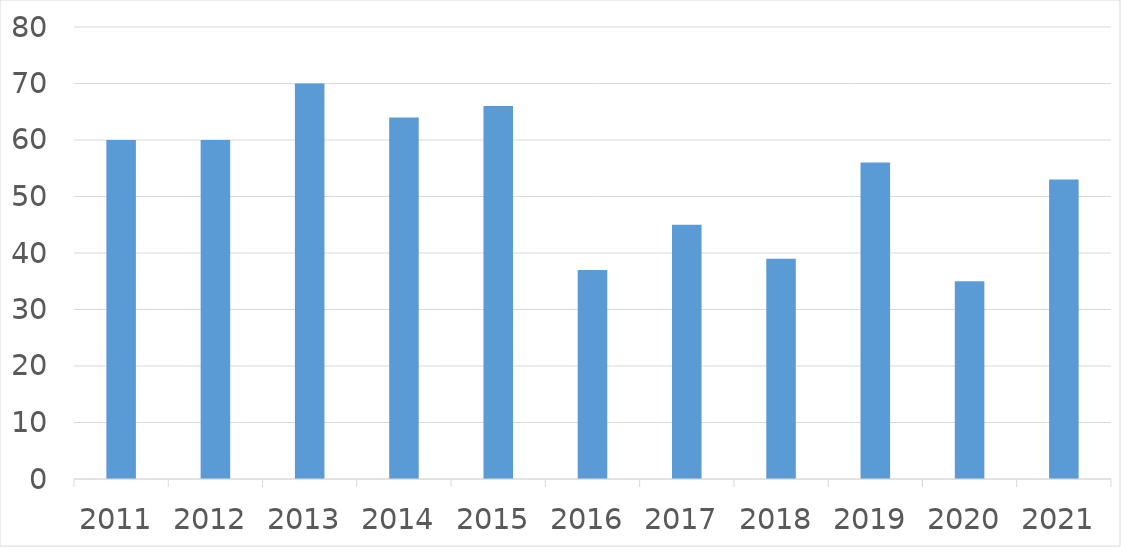
| Category | Series 0 |
|---|---|
| 2011 | 60 |
| 2012 | 60 |
| 2013 | 70 |
| 2014 | 64 |
| 2015 | 66 |
| 2016 | 37 |
| 2017 | 45 |
| 2018 | 39 |
| 2019 | 56 |
| 2020 | 35 |
| 2021 | 53 |